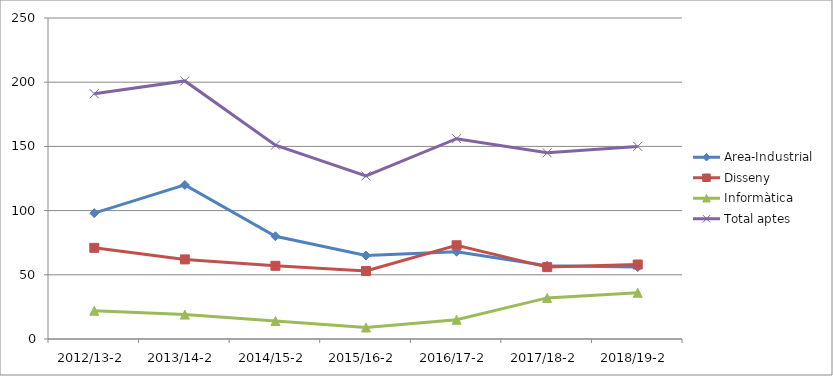
| Category | Area-Industrial | Disseny | Informàtica | Total aptes |
|---|---|---|---|---|
| 2012/13-2 | 98 | 71 | 22 | 191 |
| 2013/14-2 | 120 | 62 | 19 | 201 |
| 2014/15-2 | 80 | 57 | 14 | 151 |
| 2015/16-2 | 65 | 53 | 9 | 127 |
| 2016/17-2 | 68 | 73 | 15 | 156 |
| 2017/18-2 | 57 | 56 | 32 | 145 |
| 2018/19-2 | 56 | 58 | 36 | 150 |